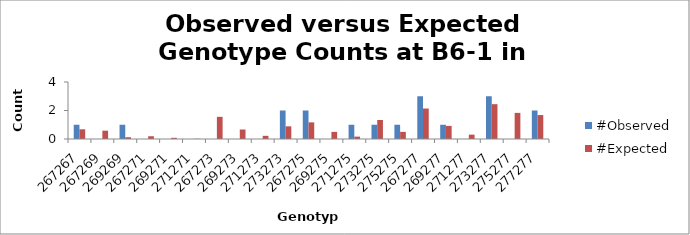
| Category | #Observed | #Expected |
|---|---|---|
| 267267.0 | 1 | 0.681 |
| 267269.0 | 0 | 0.583 |
| 269269.0 | 1 | 0.125 |
| 267271.0 | 0 | 0.194 |
| 269271.0 | 0 | 0.083 |
| 271271.0 | 0 | 0.014 |
| 267273.0 | 0 | 1.556 |
| 269273.0 | 0 | 0.667 |
| 271273.0 | 0 | 0.222 |
| 273273.0 | 2 | 0.889 |
| 267275.0 | 2 | 1.167 |
| 269275.0 | 0 | 0.5 |
| 271275.0 | 1 | 0.167 |
| 273275.0 | 1 | 1.333 |
| 275275.0 | 1 | 0.5 |
| 267277.0 | 3 | 2.139 |
| 269277.0 | 1 | 0.917 |
| 271277.0 | 0 | 0.306 |
| 273277.0 | 3 | 2.444 |
| 275277.0 | 0 | 1.833 |
| 277277.0 | 2 | 1.681 |